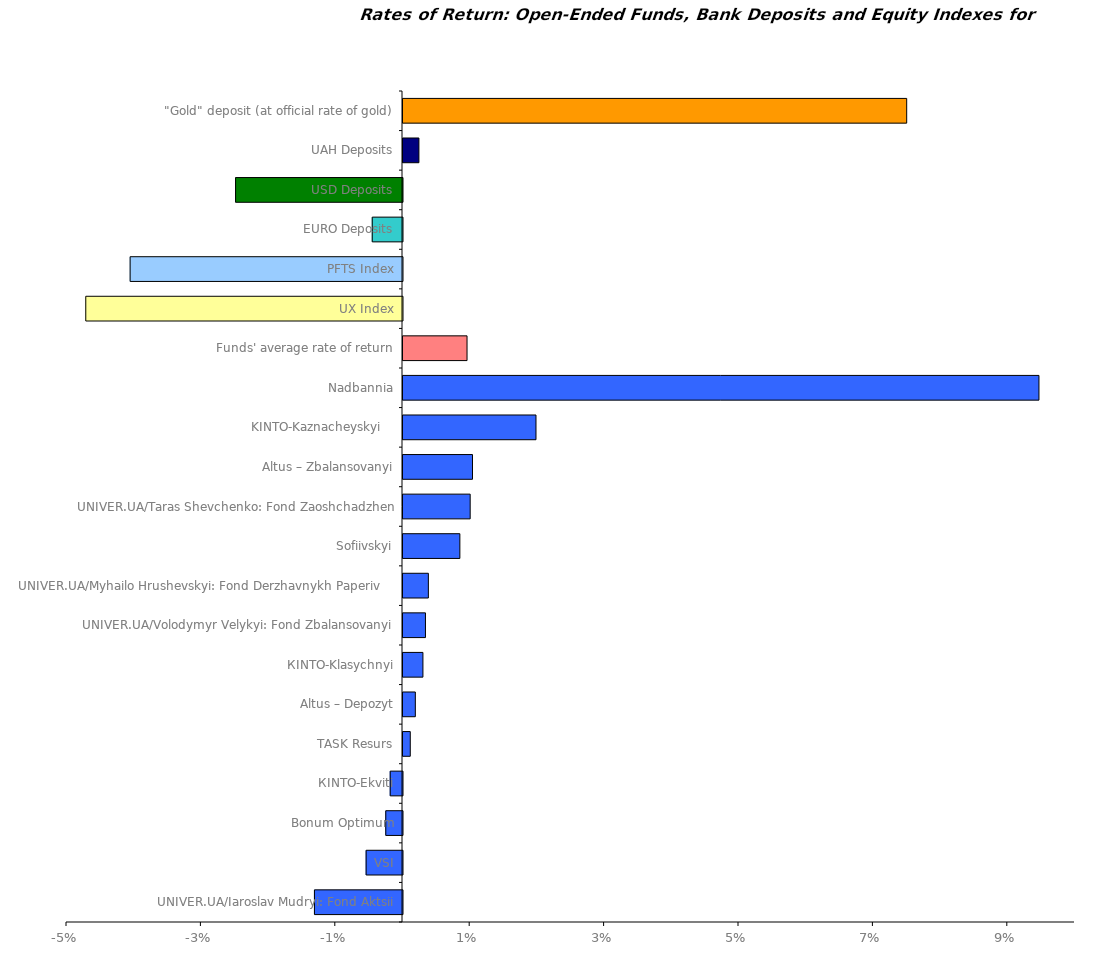
| Category | Series 0 |
|---|---|
| UNIVER.UA/Iaroslav Mudryi: Fond Aktsii | -0.013 |
| VSI | -0.005 |
| Bonum Optimum | -0.002 |
| КІNТО-Еkviti | -0.002 |
| ТАSK Resurs | 0.001 |
| Altus – Depozyt | 0.002 |
| КІNТО-Klasychnyi | 0.003 |
| UNIVER.UA/Volodymyr Velykyi: Fond Zbalansovanyi | 0.003 |
| UNIVER.UA/Myhailo Hrushevskyi: Fond Derzhavnykh Paperiv    | 0.004 |
| Sofiivskyi | 0.008 |
| UNIVER.UA/Taras Shevchenko: Fond Zaoshchadzhen | 0.01 |
| Altus – Zbalansovanyi | 0.01 |
| KINTO-Kaznacheyskyi    | 0.02 |
| Nadbannia | 0.095 |
| Funds' average rate of return | 0.01 |
| UX Index | -0.047 |
| PFTS Index | -0.041 |
| EURO Deposits | -0.005 |
| USD Deposits | -0.025 |
| UAH Deposits | 0.002 |
| "Gold" deposit (at official rate of gold) | 0.075 |